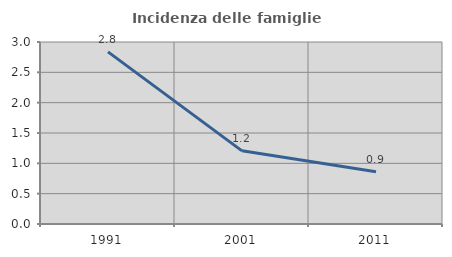
| Category | Incidenza delle famiglie numerose |
|---|---|
| 1991.0 | 2.838 |
| 2001.0 | 1.206 |
| 2011.0 | 0.86 |